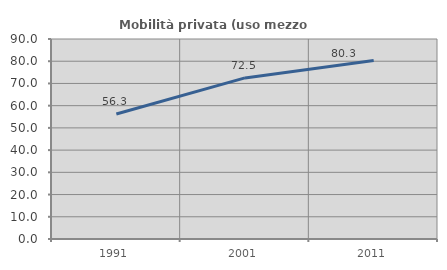
| Category | Mobilità privata (uso mezzo privato) |
|---|---|
| 1991.0 | 56.25 |
| 2001.0 | 72.5 |
| 2011.0 | 80.303 |